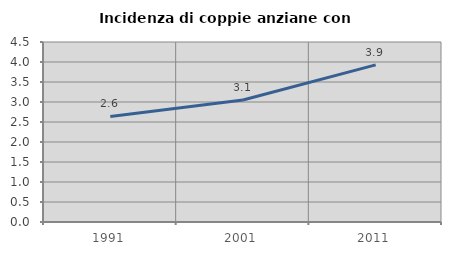
| Category | Incidenza di coppie anziane con figli |
|---|---|
| 1991.0 | 2.639 |
| 2001.0 | 3.051 |
| 2011.0 | 3.929 |